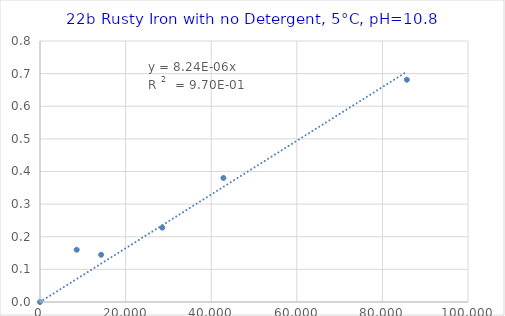
| Category | Series 0 |
|---|---|
| 0.0 | 0 |
| 8571.428571428572 | 0.16 |
| 14285.714285714286 | 0.145 |
| 28571.428571428572 | 0.228 |
| 42857.14285714286 | 0.38 |
| 85714.28571428572 | 0.681 |